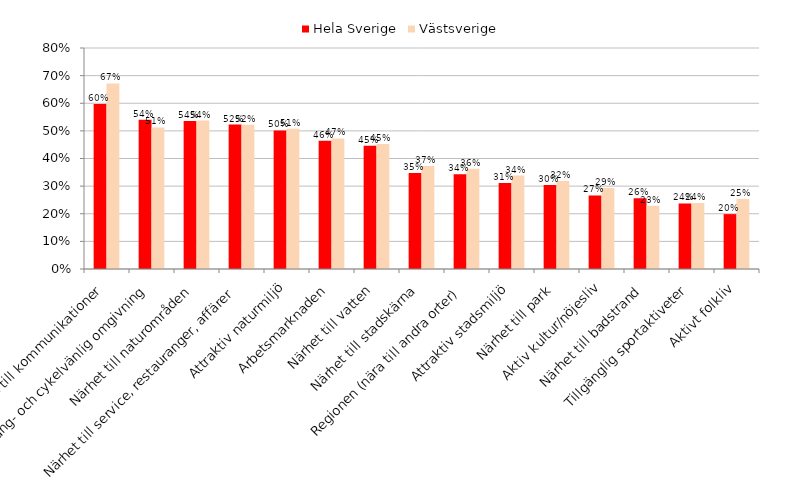
| Category | Hela Sverige | Västsverige |
|---|---|---|
| Närhet till kommunikationer | 0.597 | 0.672 |
| Gång- och cykelvänlig omgivning | 0.54 | 0.512 |
| Närhet till naturområden | 0.536 | 0.537 |
| Närhet till service, restauranger, affärer | 0.523 | 0.522 |
| Attraktiv naturmiljö | 0.501 | 0.507 |
| Arbetsmarknaden | 0.464 | 0.473 |
| Närhet till vatten | 0.446 | 0.453 |
| Närhet till stadskärna | 0.347 | 0.373 |
| Regionen (nära till andra orter) | 0.343 | 0.363 |
|  Attraktiv stadsmiljö | 0.311 | 0.338 |
| Närhet till park | 0.304 | 0.318 |
| Aktiv kultur/nöjesliv | 0.266 | 0.294 |
| Närhet till badstrand | 0.257 | 0.229 |
| Tillgänglig sportaktiveter | 0.237 | 0.239 |
| Aktivt folkliv | 0.199 | 0.254 |